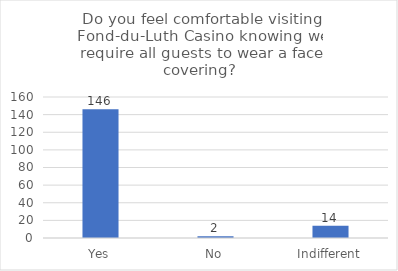
| Category | Series 0 |
|---|---|
| Yes | 146 |
| No | 2 |
| Indifferent | 14 |